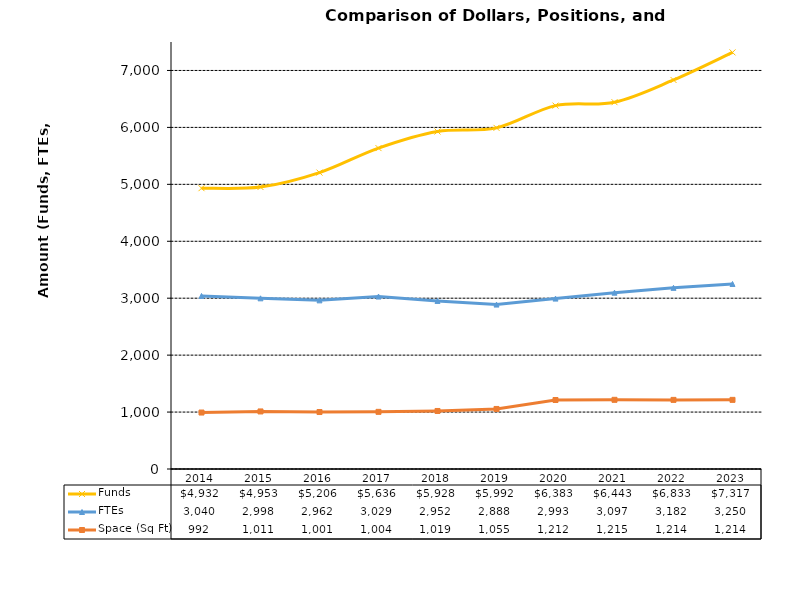
| Category | Funds | FTEs | Space (Sq Ft) |
|---|---|---|---|
| 2014.0 | 4932.368 | 3040 | 991.644 |
| 2015.0 | 4952.593 | 2998 | 1010.876 |
| 2016.0 | 5206.174 | 2962 | 1000.815 |
| 2017.0 | 5636.393 | 3029 | 1003.896 |
| 2018.0 | 5928 | 2952 | 1019.284 |
| 2019.0 | 5992 | 2888 | 1054.501 |
| 2020.0 | 6383 | 2993 | 1211.944 |
| 2021.0 | 6443 | 3097 | 1215 |
| 2022.0 | 6833 | 3182 | 1214 |
| 2023.0 | 7317.241 | 3250 | 1214.228 |